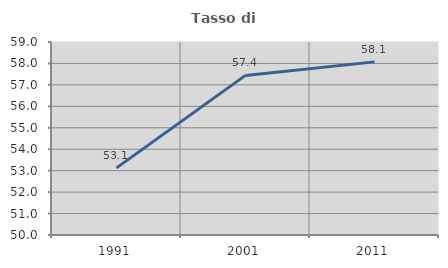
| Category | Tasso di occupazione   |
|---|---|
| 1991.0 | 53.129 |
| 2001.0 | 57.443 |
| 2011.0 | 58.073 |